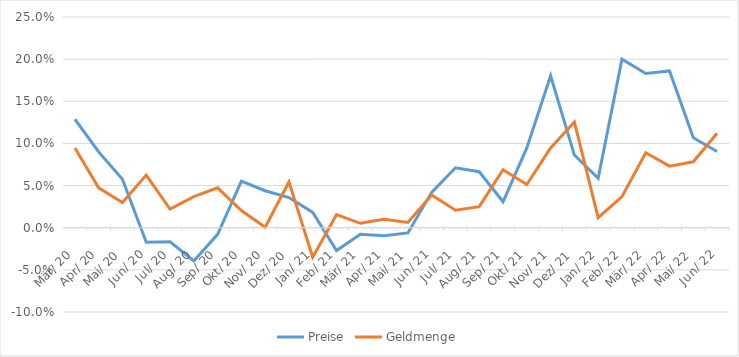
| Category | Preise | Geldmenge |
|---|---|---|
| 1920-03-05 | 0.129 | 0.095 |
| 1920-04-04 12:00:00 | 0.09 | 0.047 |
| 1920-05-05 | 0.058 | 0.03 |
| 1920-06-04 12:00:00 | -0.017 | 0.062 |
| 1920-07-05 | -0.017 | 0.022 |
| 1920-08-04 12:00:00 | -0.039 | 0.037 |
| 1920-09-04 | -0.008 | 0.047 |
| 1920-10-04 12:00:00 | 0.055 | 0.02 |
| 1920-11-04 | 0.044 | 0.001 |
| 1920-12-04 12:00:00 | 0.036 | 0.054 |
| 1921-01-04 | 0.018 | -0.035 |
| 1921-02-03 12:00:00 | -0.027 | 0.016 |
| 1921-03-06 | -0.008 | 0.005 |
| 1921-04-05 12:00:00 | -0.01 | 0.01 |
| 1921-05-06 | -0.006 | 0.006 |
| 1921-06-05 12:00:00 | 0.042 | 0.039 |
| 1921-07-06 | 0.071 | 0.021 |
| 1921-08-05 12:00:00 | 0.066 | 0.025 |
| 1921-09-05 | 0.031 | 0.069 |
| 1921-10-05 12:00:00 | 0.095 | 0.051 |
| 1921-11-05 | 0.18 | 0.095 |
| 1921-12-05 12:00:00 | 0.086 | 0.125 |
| 1922-01-05 | 0.059 | 0.012 |
| 1922-02-04 12:00:00 | 0.2 | 0.037 |
| 1922-03-07 | 0.183 | 0.089 |
| 1922-04-06 12:00:00 | 0.186 | 0.073 |
| 1922-05-07 | 0.107 | 0.078 |
| 1922-06-06 12:00:00 | 0.09 | 0.112 |